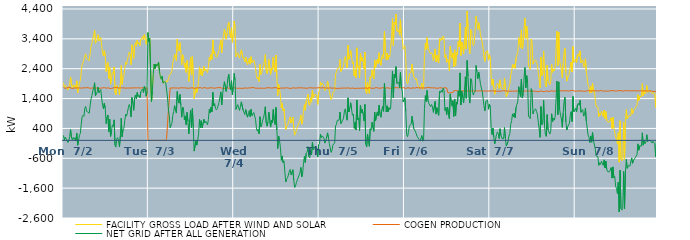
| Category | FACILITY GROSS LOAD AFTER WIND AND SOLAR | COGEN PRODUCTION | NET GRID AFTER ALL GENERATION |
|---|---|---|---|
|  Mon  7/2 | 1935 | 1768 | 167 |
|  Mon  7/2 | 1765 | 1754 | 11 |
|  Mon  7/2 | 1843 | 1743 | 100 |
|  Mon  7/2 | 1826 | 1759 | 67 |
|  Mon  7/2 | 1769 | 1756 | 13 |
|  Mon  7/2 | 1681 | 1752 | -71 |
|  Mon  7/2 | 1761 | 1776 | -15 |
|  Mon  7/2 | 1900 | 1770 | 130 |
|  Mon  7/2 | 2123 | 1761 | 362 |
|  Mon  7/2 | 1851 | 1763 | 88 |
|  Mon  7/2 | 1757 | 1735 | 22 |
|  Mon  7/2 | 1863 | 1763 | 100 |
|  Mon  7/2 | 1781 | 1754 | 27 |
|  Mon  7/2 | 1845 | 1758 | 87 |
|  Mon  7/2 | 1740 | 1756 | -16 |
|  Mon  7/2 | 1995 | 1759 | 236 |
|  Mon  7/2 | 1589 | 1752 | -163 |
|  Mon  7/2 | 1749 | 1757 | -8 |
|  Mon  7/2 | 1929 | 1757 | 172 |
|  Mon  7/2 | 2001 | 1770 | 231 |
|  Mon  7/2 | 2288 | 1750 | 538 |
|  Mon  7/2 | 2538 | 1747 | 791 |
|  Mon  7/2 | 2598 | 1759 | 839 |
|  Mon  7/2 | 2570 | 1769 | 801 |
|  Mon  7/2 | 2824 | 1759 | 1065 |
|  Mon  7/2 | 2896 | 1758 | 1138 |
|  Mon  7/2 | 2749 | 1765 | 984 |
|  Mon  7/2 | 2712 | 1762 | 950 |
|  Mon  7/2 | 2735 | 1764 | 971 |
|  Mon  7/2 | 2668 | 1759 | 909 |
|  Mon  7/2 | 2905 | 1742 | 1163 |
|  Mon  7/2 | 3137 | 1756 | 1381 |
|  Mon  7/2 | 3253 | 1755 | 1498 |
|  Mon  7/2 | 3418 | 1761 | 1657 |
|  Mon  7/2 | 3497 | 1751 | 1746 |
|  Mon  7/2 | 3693 | 1764 | 1929 |
|  Mon  7/2 | 3253 | 1754 | 1499 |
|  Mon  7/2 | 3302 | 1768 | 1534 |
|  Mon  7/2 | 3380 | 1753 | 1627 |
|  Mon  7/2 | 3540 | 1758 | 1782 |
|  Mon  7/2 | 3332 | 1736 | 1596 |
|  Mon  7/2 | 3360 | 1747 | 1613 |
|  Mon  7/2 | 3449 | 1749 | 1700 |
|  Mon  7/2 | 3179 | 1761 | 1418 |
|  Mon  7/2 | 2931 | 1758 | 1173 |
|  Mon  7/2 | 2824 | 1765 | 1059 |
|  Mon  7/2 | 3007 | 1767 | 1240 |
|  Mon  7/2 | 2823 | 1752 | 1071 |
|  Mon  7/2 | 2304 | 1745 | 559 |
|  Mon  7/2 | 2541 | 1767 | 774 |
|  Mon  7/2 | 2614 | 1763 | 851 |
|  Mon  7/2 | 2064 | 1774 | 290 |
|  Mon  7/2 | 2455 | 1742 | 713 |
|  Mon  7/2 | 1881 | 1749 | 132 |
|  Mon  7/2 | 2039 | 1739 | 300 |
|  Mon  7/2 | 2265 | 1748 | 517 |
|  Mon  7/2 | 2229 | 1761 | 468 |
|  Mon  7/2 | 2457 | 1770 | 687 |
|  Mon  7/2 | 1599 | 1762 | -163 |
|  Mon  7/2 | 1522 | 1749 | -227 |
|  Mon  7/2 | 1834 | 1777 | 57 |
|  Mon  7/2 | 1836 | 1745 | 91 |
|  Mon  7/2 | 1726 | 1748 | -22 |
|  Mon  7/2 | 1526 | 1747 | -221 |
|  Mon  7/2 | 1903 | 1760 | 143 |
|  Mon  7/2 | 2509 | 1767 | 742 |
|  Mon  7/2 | 1874 | 1756 | 118 |
|  Mon  7/2 | 2131 | 1762 | 369 |
|  Mon  7/2 | 2166 | 1759 | 407 |
|  Mon  7/2 | 2427 | 1758 | 669 |
|  Mon  7/2 | 2622 | 1748 | 874 |
|  Mon  7/2 | 2547 | 1734 | 813 |
|  Mon  7/2 | 2699 | 1755 | 944 |
|  Mon  7/2 | 2839 | 1746 | 1093 |
|  Mon  7/2 | 2955 | 1754 | 1201 |
|  Mon  7/2 | 2888 | 1769 | 1119 |
|  Mon  7/2 | 2537 | 1752 | 785 |
|  Mon  7/2 | 3199 | 1766 | 1433 |
|  Mon  7/2 | 3011 | 1756 | 1255 |
|  Mon  7/2 | 2738 | 1732 | 1006 |
|  Mon  7/2 | 3177 | 1760 | 1417 |
|  Mon  7/2 | 3274 | 1753 | 1521 |
|  Mon  7/2 | 3150 | 1756 | 1394 |
|  Mon  7/2 | 3361 | 1757 | 1604 |
|  Mon  7/2 | 3230 | 1763 | 1467 |
|  Mon  7/2 | 3270 | 1766 | 1504 |
|  Mon  7/2 | 3175 | 1750 | 1425 |
|  Mon  7/2 | 3377 | 1749 | 1628 |
|  Mon  7/2 | 3422 | 1761 | 1661 |
|  Mon  7/2 | 3478 | 1758 | 1720 |
|  Mon  7/2 | 3359 | 1756 | 1603 |
|  Mon  7/2 | 3549 | 1745 | 1804 |
|  Mon  7/2 | 3480 | 1753 | 1727 |
|  Mon  7/2 | 3212 | 1734 | 1478 |
|  Mon  7/2 | 3386 | 1753 | 1633 |
|  Mon  7/2 | 3609 | 0 | 3609 |
|  Tue  7/3 | 3308 | 0 | 3308 |
|  Tue  7/3 | 3413 | 0 | 3413 |
|  Tue  7/3 | 3393 | 0 | 3393 |
|  Tue  7/3 | 1288 | 0 | 1288 |
|  Tue  7/3 | 1656 | 0 | 1656 |
|  Tue  7/3 | 2215 | 0 | 2215 |
|  Tue  7/3 | 2554 | 0 | 2554 |
|  Tue  7/3 | 2406 | 0 | 2406 |
|  Tue  7/3 | 2554 | 0 | 2554 |
|  Tue  7/3 | 2480 | 0 | 2480 |
|  Tue  7/3 | 2468 | 0 | 2468 |
|  Tue  7/3 | 2619 | 0 | 2619 |
|  Tue  7/3 | 2304 | 0 | 2304 |
|  Tue  7/3 | 2134 | 0 | 2134 |
|  Tue  7/3 | 2043 | 0 | 2043 |
|  Tue  7/3 | 2154 | 0 | 2154 |
|  Tue  7/3 | 1917 | 0 | 1917 |
|  Tue  7/3 | 1903 | 0 | 1903 |
|  Tue  7/3 | 1972 | 0 | 1972 |
|  Tue  7/3 | 1931 | 0 | 1931 |
|  Tue  7/3 | 2001 | 52 | 1949 |
|  Tue  7/3 | 1963 | 510 | 1453 |
|  Tue  7/3 | 2048 | 997 | 1051 |
|  Tue  7/3 | 2173 | 1348 | 825 |
|  Tue  7/3 | 2186 | 1759 | 427 |
|  Tue  7/3 | 2253 | 1745 | 508 |
|  Tue  7/3 | 2323 | 1748 | 575 |
|  Tue  7/3 | 2600 | 1763 | 837 |
|  Tue  7/3 | 2729 | 1763 | 966 |
|  Tue  7/3 | 2894 | 1731 | 1163 |
|  Tue  7/3 | 2760 | 1752 | 1008 |
|  Tue  7/3 | 2666 | 1752 | 914 |
|  Tue  7/3 | 3390 | 1754 | 1636 |
|  Tue  7/3 | 3088 | 1742 | 1346 |
|  Tue  7/3 | 2991 | 1746 | 1245 |
|  Tue  7/3 | 3273 | 1737 | 1536 |
|  Tue  7/3 | 2946 | 1764 | 1182 |
|  Tue  7/3 | 2537 | 1760 | 777 |
|  Tue  7/3 | 2874 | 1757 | 1117 |
|  Tue  7/3 | 2820 | 1767 | 1053 |
|  Tue  7/3 | 2450 | 1761 | 689 |
|  Tue  7/3 | 2587 | 1768 | 819 |
|  Tue  7/3 | 2278 | 1753 | 525 |
|  Tue  7/3 | 2673 | 1736 | 937 |
|  Tue  7/3 | 2385 | 1746 | 639 |
|  Tue  7/3 | 1968 | 1751 | 217 |
|  Tue  7/3 | 2432 | 1750 | 682 |
|  Tue  7/3 | 2778 | 1762 | 1016 |
|  Tue  7/3 | 2187 | 1759 | 428 |
|  Tue  7/3 | 2819 | 1754 | 1065 |
|  Tue  7/3 | 2178 | 1754 | 424 |
|  Tue  7/3 | 1394 | 1754 | -360 |
|  Tue  7/3 | 1381 | 1740 | -359 |
|  Tue  7/3 | 1762 | 1759 | 3 |
|  Tue  7/3 | 1602 | 1761 | -159 |
|  Tue  7/3 | 1761 | 1749 | 12 |
|  Tue  7/3 | 1971 | 1756 | 215 |
|  Tue  7/3 | 2462 | 1759 | 703 |
|  Tue  7/3 | 2204 | 1770 | 434 |
|  Tue  7/3 | 2397 | 1737 | 660 |
|  Tue  7/3 | 2162 | 1740 | 422 |
|  Tue  7/3 | 2145 | 1752 | 393 |
|  Tue  7/3 | 2476 | 1772 | 704 |
|  Tue  7/3 | 2329 | 1744 | 585 |
|  Tue  7/3 | 2391 | 1754 | 637 |
|  Tue  7/3 | 2345 | 1758 | 587 |
|  Tue  7/3 | 2267 | 1749 | 518 |
|  Tue  7/3 | 2444 | 1748 | 696 |
|  Tue  7/3 | 2787 | 1752 | 1035 |
|  Tue  7/3 | 2670 | 1752 | 918 |
|  Tue  7/3 | 2875 | 1765 | 1110 |
|  Tue  7/3 | 2719 | 1763 | 956 |
|  Tue  7/3 | 3364 | 1754 | 1610 |
|  Tue  7/3 | 2909 | 1759 | 1150 |
|  Tue  7/3 | 2977 | 1747 | 1230 |
|  Tue  7/3 | 2819 | 1747 | 1072 |
|  Tue  7/3 | 2777 | 1758 | 1019 |
|  Tue  7/3 | 2818 | 1755 | 1063 |
|  Tue  7/3 | 2799 | 1765 | 1034 |
|  Tue  7/3 | 3018 | 1742 | 1276 |
|  Tue  7/3 | 3047 | 1770 | 1277 |
|  Tue  7/3 | 3370 | 1746 | 1624 |
|  Tue  7/3 | 2937 | 1750 | 1187 |
|  Tue  7/3 | 3282 | 1740 | 1542 |
|  Tue  7/3 | 3524 | 1743 | 1781 |
|  Tue  7/3 | 3731 | 1767 | 1964 |
|  Tue  7/3 | 3701 | 1740 | 1961 |
|  Tue  7/3 | 3390 | 1749 | 1641 |
|  Tue  7/3 | 3577 | 1763 | 1814 |
|  Tue  7/3 | 3867 | 1751 | 2116 |
|  Tue  7/3 | 3957 | 1746 | 2211 |
|  Tue  7/3 | 3586 | 1762 | 1824 |
|  Tue  7/3 | 3440 | 1752 | 1688 |
|  Tue  7/3 | 3768 | 1771 | 1997 |
|  Tue  7/3 | 3267 | 1738 | 1529 |
|  Tue  7/3 | 3558 | 1756 | 1802 |
|  Wed  7/4 | 3999 | 1759 | 2240 |
|  Wed  7/4 | 3775 | 1769 | 2006 |
|  Wed  7/4 | 2798 | 1757 | 1041 |
|  Wed  7/4 | 2891 | 1763 | 1128 |
|  Wed  7/4 | 2934 | 1739 | 1195 |
|  Wed  7/4 | 2909 | 1733 | 1176 |
|  Wed  7/4 | 2751 | 1749 | 1002 |
|  Wed  7/4 | 2890 | 1764 | 1126 |
|  Wed  7/4 | 3032 | 1742 | 1290 |
|  Wed  7/4 | 3046 | 1752 | 1294 |
|  Wed  7/4 | 2759 | 1742 | 1017 |
|  Wed  7/4 | 2722 | 1736 | 986 |
|  Wed  7/4 | 2626 | 1759 | 867 |
|  Wed  7/4 | 2787 | 1757 | 1030 |
|  Wed  7/4 | 2765 | 1745 | 1020 |
|  Wed  7/4 | 2535 | 1757 | 778 |
|  Wed  7/4 | 2616 | 1758 | 858 |
|  Wed  7/4 | 2752 | 1759 | 993 |
|  Wed  7/4 | 2550 | 1754 | 796 |
|  Wed  7/4 | 2803 | 1764 | 1039 |
|  Wed  7/4 | 2596 | 1769 | 827 |
|  Wed  7/4 | 2582 | 1767 | 815 |
|  Wed  7/4 | 2698 | 1766 | 932 |
|  Wed  7/4 | 2677 | 1748 | 929 |
|  Wed  7/4 | 2455 | 1746 | 709 |
|  Wed  7/4 | 2172 | 1757 | 415 |
|  Wed  7/4 | 2058 | 1748 | 310 |
|  Wed  7/4 | 2122 | 1753 | 369 |
|  Wed  7/4 | 1962 | 1745 | 217 |
|  Wed  7/4 | 2540 | 1749 | 791 |
|  Wed  7/4 | 2205 | 1750 | 455 |
|  Wed  7/4 | 2267 | 1746 | 521 |
|  Wed  7/4 | 2426 | 1746 | 680 |
|  Wed  7/4 | 2523 | 1769 | 754 |
|  Wed  7/4 | 2644 | 1742 | 902 |
|  Wed  7/4 | 2873 | 1748 | 1125 |
|  Wed  7/4 | 2340 | 1756 | 584 |
|  Wed  7/4 | 2232 | 1758 | 474 |
|  Wed  7/4 | 2376 | 1763 | 613 |
|  Wed  7/4 | 2706 | 1761 | 945 |
|  Wed  7/4 | 2703 | 1762 | 941 |
|  Wed  7/4 | 2207 | 1762 | 445 |
|  Wed  7/4 | 2419 | 1751 | 668 |
|  Wed  7/4 | 2357 | 1768 | 589 |
|  Wed  7/4 | 2791 | 1758 | 1033 |
|  Wed  7/4 | 2410 | 1749 | 661 |
|  Wed  7/4 | 2295 | 1766 | 529 |
|  Wed  7/4 | 2860 | 1758 | 1102 |
|  Wed  7/4 | 2105 | 1757 | 348 |
|  Wed  7/4 | 1497 | 1772 | -275 |
|  Wed  7/4 | 1874 | 1728 | 146 |
|  Wed  7/4 | 1736 | 1746 | -10 |
|  Wed  7/4 | 1516 | 1750 | -234 |
|  Wed  7/4 | 1086 | 1754 | -668 |
|  Wed  7/4 | 1233 | 1754 | -521 |
|  Wed  7/4 | 996 | 1744 | -748 |
|  Wed  7/4 | 1060 | 1747 | -687 |
|  Wed  7/4 | 690 | 1745 | -1055 |
|  Wed  7/4 | 367 | 1758 | -1391 |
|  Wed  7/4 | 460 | 1753 | -1293 |
|  Wed  7/4 | 501 | 1759 | -1258 |
|  Wed  7/4 | 511 | 1739 | -1228 |
|  Wed  7/4 | 694 | 1743 | -1049 |
|  Wed  7/4 | 779 | 1754 | -975 |
|  Wed  7/4 | 582 | 1740 | -1158 |
|  Wed  7/4 | 599 | 1750 | -1151 |
|  Wed  7/4 | 777 | 1763 | -986 |
|  Wed  7/4 | 404 | 1737 | -1333 |
|  Wed  7/4 | 173 | 1752 | -1579 |
|  Wed  7/4 | 233 | 1757 | -1524 |
|  Wed  7/4 | 339 | 1749 | -1410 |
|  Wed  7/4 | 438 | 1762 | -1324 |
|  Wed  7/4 | 444 | 1763 | -1319 |
|  Wed  7/4 | 600 | 1761 | -1161 |
|  Wed  7/4 | 672 | 1757 | -1085 |
|  Wed  7/4 | 851 | 1757 | -906 |
|  Wed  7/4 | 542 | 1762 | -1220 |
|  Wed  7/4 | 651 | 1752 | -1101 |
|  Wed  7/4 | 1002 | 1752 | -750 |
|  Wed  7/4 | 1196 | 1736 | -540 |
|  Wed  7/4 | 1006 | 1751 | -745 |
|  Wed  7/4 | 1317 | 1752 | -435 |
|  Wed  7/4 | 1346 | 1743 | -397 |
|  Wed  7/4 | 1543 | 1756 | -213 |
|  Wed  7/4 | 1216 | 1760 | -544 |
|  Wed  7/4 | 1169 | 1754 | -585 |
|  Wed  7/4 | 1427 | 1763 | -336 |
|  Wed  7/4 | 1280 | 1761 | -481 |
|  Wed  7/4 | 1683 | 1754 | -71 |
|  Wed  7/4 | 1433 | 1754 | -321 |
|  Wed  7/4 | 1463 | 1755 | -292 |
|  Wed  7/4 | 1549 | 1749 | -200 |
|  Wed  7/4 | 1523 | 1754 | -231 |
|  Wed  7/4 | 1503 | 1761 | -258 |
|  Wed  7/4 | 1203 | 1761 | -558 |
|  Wed  7/4 | 1614 | 1762 | -148 |
|  Thu  7/5 | 1662 | 1765 | -103 |
|  Thu  7/5 | 1959 | 1753 | 206 |
|  Thu  7/5 | 1847 | 1754 | 93 |
|  Thu  7/5 | 1915 | 1765 | 150 |
|  Thu  7/5 | 1879 | 1764 | 115 |
|  Thu  7/5 | 1810 | 1750 | 60 |
|  Thu  7/5 | 1660 | 1753 | -93 |
|  Thu  7/5 | 1725 | 1741 | -16 |
|  Thu  7/5 | 1763 | 1756 | 7 |
|  Thu  7/5 | 1987 | 1736 | 251 |
|  Thu  7/5 | 1834 | 1747 | 87 |
|  Thu  7/5 | 1648 | 1750 | -102 |
|  Thu  7/5 | 1640 | 1761 | -121 |
|  Thu  7/5 | 1362 | 1766 | -404 |
|  Thu  7/5 | 1422 | 1749 | -327 |
|  Thu  7/5 | 1596 | 1755 | -159 |
|  Thu  7/5 | 1590 | 1753 | -163 |
|  Thu  7/5 | 1660 | 1743 | -83 |
|  Thu  7/5 | 2225 | 1745 | 480 |
|  Thu  7/5 | 2288 | 1750 | 538 |
|  Thu  7/5 | 2411 | 1738 | 673 |
|  Thu  7/5 | 2442 | 1756 | 686 |
|  Thu  7/5 | 2424 | 1748 | 676 |
|  Thu  7/5 | 2709 | 1759 | 950 |
|  Thu  7/5 | 2304 | 1743 | 561 |
|  Thu  7/5 | 2356 | 1751 | 605 |
|  Thu  7/5 | 2428 | 1753 | 675 |
|  Thu  7/5 | 2491 | 1746 | 745 |
|  Thu  7/5 | 2744 | 1752 | 992 |
|  Thu  7/5 | 2812 | 1757 | 1055 |
|  Thu  7/5 | 2592 | 1749 | 843 |
|  Thu  7/5 | 2427 | 1752 | 675 |
|  Thu  7/5 | 3184 | 1760 | 1424 |
|  Thu  7/5 | 2714 | 1764 | 950 |
|  Thu  7/5 | 2819 | 1744 | 1075 |
|  Thu  7/5 | 3012 | 1753 | 1259 |
|  Thu  7/5 | 2795 | 1746 | 1049 |
|  Thu  7/5 | 2565 | 1725 | 840 |
|  Thu  7/5 | 2629 | 1752 | 877 |
|  Thu  7/5 | 2156 | 1753 | 403 |
|  Thu  7/5 | 2345 | 1737 | 608 |
|  Thu  7/5 | 2095 | 1749 | 346 |
|  Thu  7/5 | 3100 | 1747 | 1353 |
|  Thu  7/5 | 2441 | 1751 | 690 |
|  Thu  7/5 | 2491 | 1744 | 747 |
|  Thu  7/5 | 2090 | 1763 | 327 |
|  Thu  7/5 | 2925 | 1745 | 1180 |
|  Thu  7/5 | 2672 | 1753 | 919 |
|  Thu  7/5 | 2786 | 1753 | 1033 |
|  Thu  7/5 | 2629 | 1753 | 876 |
|  Thu  7/5 | 2397 | 1746 | 651 |
|  Thu  7/5 | 2958 | 1755 | 1203 |
|  Thu  7/5 | 1636 | 1762 | -126 |
|  Thu  7/5 | 1562 | 1779 | -217 |
|  Thu  7/5 | 1950 | 1736 | 214 |
|  Thu  7/5 | 1698 | 1740 | -42 |
|  Thu  7/5 | 1572 | 1769 | -197 |
|  Thu  7/5 | 2132 | 1742 | 390 |
|  Thu  7/5 | 2090 | 1747 | 343 |
|  Thu  7/5 | 2361 | 1756 | 605 |
|  Thu  7/5 | 2361 | 1744 | 617 |
|  Thu  7/5 | 2055 | 1752 | 303 |
|  Thu  7/5 | 2694 | 1751 | 943 |
|  Thu  7/5 | 2427 | 1768 | 659 |
|  Thu  7/5 | 2459 | 1770 | 689 |
|  Thu  7/5 | 2715 | 1762 | 953 |
|  Thu  7/5 | 2570 | 1749 | 821 |
|  Thu  7/5 | 2933 | 1754 | 1179 |
|  Thu  7/5 | 2609 | 1748 | 861 |
|  Thu  7/5 | 2515 | 1741 | 774 |
|  Thu  7/5 | 2788 | 1758 | 1030 |
|  Thu  7/5 | 2874 | 1741 | 1133 |
|  Thu  7/5 | 2738 | 1765 | 973 |
|  Thu  7/5 | 3653 | 1741 | 1912 |
|  Thu  7/5 | 3142 | 1743 | 1399 |
|  Thu  7/5 | 2688 | 1737 | 951 |
|  Thu  7/5 | 2922 | 1763 | 1159 |
|  Thu  7/5 | 2708 | 1755 | 953 |
|  Thu  7/5 | 2850 | 1750 | 1100 |
|  Thu  7/5 | 2796 | 1766 | 1030 |
|  Thu  7/5 | 2829 | 1745 | 1084 |
|  Thu  7/5 | 3449 | 1761 | 1688 |
|  Thu  7/5 | 4082 | 1758 | 2324 |
|  Thu  7/5 | 3172 | 1747 | 1425 |
|  Thu  7/5 | 3961 | 1739 | 2222 |
|  Thu  7/5 | 3871 | 1775 | 2096 |
|  Thu  7/5 | 4225 | 1757 | 2468 |
|  Thu  7/5 | 3669 | 1761 | 1908 |
|  Thu  7/5 | 3632 | 1755 | 1877 |
|  Thu  7/5 | 3702 | 1758 | 1944 |
|  Thu  7/5 | 3524 | 1760 | 1764 |
|  Thu  7/5 | 4040 | 1765 | 2275 |
|  Thu  7/5 | 3506 | 1740 | 1766 |
|  Thu  7/5 | 3416 | 1762 | 1654 |
|  Thu  7/5 | 3056 | 1768 | 1288 |
|  Thu  7/5 | 3115 | 1762 | 1353 |
|  Fri  7/6 | 3171 | 1743 | 1428 |
|  Fri  7/6 | 2710 | 1741 | 969 |
|  Fri  7/6 | 1960 | 1762 | 198 |
|  Fri  7/6 | 1882 | 1762 | 120 |
|  Fri  7/6 | 2031 | 1761 | 270 |
|  Fri  7/6 | 2234 | 1756 | 478 |
|  Fri  7/6 | 2220 | 1750 | 470 |
|  Fri  7/6 | 2289 | 1740 | 549 |
|  Fri  7/6 | 2559 | 1749 | 810 |
|  Fri  7/6 | 2542 | 1764 | 778 |
|  Fri  7/6 | 2134 | 1744 | 390 |
|  Fri  7/6 | 2094 | 1748 | 346 |
|  Fri  7/6 | 2029 | 1749 | 280 |
|  Fri  7/6 | 2079 | 1771 | 308 |
|  Fri  7/6 | 1884 | 1766 | 118 |
|  Fri  7/6 | 1853 | 1761 | 92 |
|  Fri  7/6 | 1783 | 1755 | 28 |
|  Fri  7/6 | 1734 | 1756 | -22 |
|  Fri  7/6 | 1811 | 1744 | 67 |
|  Fri  7/6 | 1913 | 1752 | 161 |
|  Fri  7/6 | 1710 | 1738 | -28 |
|  Fri  7/6 | 1777 | 1761 | 16 |
|  Fri  7/6 | 2823 | 1757 | 1066 |
|  Fri  7/6 | 3249 | 1751 | 1498 |
|  Fri  7/6 | 3043 | 1742 | 1301 |
|  Fri  7/6 | 3439 | 1767 | 1672 |
|  Fri  7/6 | 3074 | 1745 | 1329 |
|  Fri  7/6 | 3003 | 1769 | 1234 |
|  Fri  7/6 | 2987 | 1767 | 1220 |
|  Fri  7/6 | 2891 | 1761 | 1130 |
|  Fri  7/6 | 2934 | 1734 | 1200 |
|  Fri  7/6 | 2880 | 1758 | 1122 |
|  Fri  7/6 | 2675 | 1737 | 938 |
|  Fri  7/6 | 2685 | 1758 | 927 |
|  Fri  7/6 | 3061 | 1757 | 1304 |
|  Fri  7/6 | 2629 | 1749 | 880 |
|  Fri  7/6 | 2853 | 1759 | 1094 |
|  Fri  7/6 | 2682 | 1744 | 938 |
|  Fri  7/6 | 2587 | 1751 | 836 |
|  Fri  7/6 | 3401 | 1761 | 1640 |
|  Fri  7/6 | 3332 | 1738 | 1594 |
|  Fri  7/6 | 3435 | 1759 | 1676 |
|  Fri  7/6 | 3363 | 1752 | 1611 |
|  Fri  7/6 | 3495 | 1745 | 1750 |
|  Fri  7/6 | 3427 | 1747 | 1680 |
|  Fri  7/6 | 2770 | 1766 | 1004 |
|  Fri  7/6 | 2865 | 1763 | 1102 |
|  Fri  7/6 | 2614 | 1751 | 863 |
|  Fri  7/6 | 2717 | 1609 | 1108 |
|  Fri  7/6 | 2683 | 1603 | 1080 |
|  Fri  7/6 | 2323 | 1592 | 731 |
|  Fri  7/6 | 3160 | 1603 | 1557 |
|  Fri  7/6 | 2884 | 1597 | 1287 |
|  Fri  7/6 | 2752 | 1606 | 1146 |
|  Fri  7/6 | 2930 | 1602 | 1328 |
|  Fri  7/6 | 2465 | 1662 | 803 |
|  Fri  7/6 | 3035 | 1648 | 1387 |
|  Fri  7/6 | 2489 | 1665 | 824 |
|  Fri  7/6 | 2948 | 1661 | 1287 |
|  Fri  7/6 | 2870 | 1657 | 1213 |
|  Fri  7/6 | 3306 | 1651 | 1655 |
|  Fri  7/6 | 3132 | 1652 | 1480 |
|  Fri  7/6 | 3922 | 1663 | 2259 |
|  Fri  7/6 | 2841 | 1653 | 1188 |
|  Fri  7/6 | 3298 | 1656 | 1642 |
|  Fri  7/6 | 3087 | 1659 | 1428 |
|  Fri  7/6 | 2905 | 1653 | 1252 |
|  Fri  7/6 | 3301 | 1660 | 1641 |
|  Fri  7/6 | 3792 | 1662 | 2130 |
|  Fri  7/6 | 3059 | 1653 | 1406 |
|  Fri  7/6 | 4323 | 1648 | 2675 |
|  Fri  7/6 | 3799 | 1648 | 2151 |
|  Fri  7/6 | 3120 | 1667 | 1453 |
|  Fri  7/6 | 2900 | 1651 | 1249 |
|  Fri  7/6 | 3718 | 1652 | 2066 |
|  Fri  7/6 | 3680 | 1657 | 2023 |
|  Fri  7/6 | 3281 | 1646 | 1635 |
|  Fri  7/6 | 3174 | 1657 | 1517 |
|  Fri  7/6 | 3270 | 1667 | 1603 |
|  Fri  7/6 | 3288 | 1644 | 1644 |
|  Fri  7/6 | 4165 | 1656 | 2509 |
|  Fri  7/6 | 3959 | 1658 | 2301 |
|  Fri  7/6 | 3713 | 1648 | 2065 |
|  Fri  7/6 | 3936 | 1655 | 2281 |
|  Fri  7/6 | 3771 | 1661 | 2110 |
|  Fri  7/6 | 3534 | 1661 | 1873 |
|  Fri  7/6 | 3525 | 1653 | 1872 |
|  Fri  7/6 | 3281 | 1648 | 1633 |
|  Fri  7/6 | 3046 | 1662 | 1384 |
|  Fri  7/6 | 2777 | 1645 | 1132 |
|  Fri  7/6 | 2645 | 1654 | 991 |
|  Fri  7/6 | 2958 | 1657 | 1301 |
|  Fri  7/6 | 2952 | 1661 | 1291 |
|  Fri  7/6 | 2999 | 1649 | 1350 |
|  Fri  7/6 | 2685 | 1642 | 1043 |
|  Fri  7/6 | 2868 | 1655 | 1213 |
|  Sat  7/7 | 2779 | 1652 | 1127 |
|  Sat  7/7 | 2082 | 1661 | 421 |
|  Sat  7/7 | 1844 | 1654 | 190 |
|  Sat  7/7 | 2055 | 1649 | 406 |
|  Sat  7/7 | 1768 | 1657 | 111 |
|  Sat  7/7 | 1541 | 1656 | -115 |
|  Sat  7/7 | 1705 | 1658 | 47 |
|  Sat  7/7 | 1836 | 1641 | 195 |
|  Sat  7/7 | 1920 | 1638 | 282 |
|  Sat  7/7 | 1875 | 1654 | 221 |
|  Sat  7/7 | 1737 | 1674 | 63 |
|  Sat  7/7 | 2029 | 1639 | 390 |
|  Sat  7/7 | 1811 | 1647 | 164 |
|  Sat  7/7 | 1729 | 1658 | 71 |
|  Sat  7/7 | 1702 | 1648 | 54 |
|  Sat  7/7 | 1713 | 1661 | 52 |
|  Sat  7/7 | 2091 | 1663 | 428 |
|  Sat  7/7 | 1730 | 1658 | 72 |
|  Sat  7/7 | 1463 | 1655 | -192 |
|  Sat  7/7 | 1474 | 1651 | -177 |
|  Sat  7/7 | 1620 | 1660 | -40 |
|  Sat  7/7 | 1789 | 1646 | 143 |
|  Sat  7/7 | 1885 | 1653 | 232 |
|  Sat  7/7 | 2186 | 1647 | 539 |
|  Sat  7/7 | 2292 | 1632 | 660 |
|  Sat  7/7 | 2538 | 1651 | 887 |
|  Sat  7/7 | 2438 | 1644 | 794 |
|  Sat  7/7 | 2557 | 1644 | 913 |
|  Sat  7/7 | 2412 | 1656 | 756 |
|  Sat  7/7 | 2763 | 1655 | 1108 |
|  Sat  7/7 | 2867 | 1665 | 1202 |
|  Sat  7/7 | 2962 | 1653 | 1309 |
|  Sat  7/7 | 3446 | 1648 | 1798 |
|  Sat  7/7 | 3269 | 1658 | 1611 |
|  Sat  7/7 | 3103 | 1641 | 1462 |
|  Sat  7/7 | 3701 | 1646 | 2055 |
|  Sat  7/7 | 3069 | 1652 | 1417 |
|  Sat  7/7 | 3179 | 1638 | 1541 |
|  Sat  7/7 | 3745 | 1655 | 2090 |
|  Sat  7/7 | 4093 | 1651 | 2442 |
|  Sat  7/7 | 3417 | 1655 | 1762 |
|  Sat  7/7 | 3824 | 1657 | 2167 |
|  Sat  7/7 | 3571 | 1651 | 1920 |
|  Sat  7/7 | 2472 | 1659 | 813 |
|  Sat  7/7 | 2463 | 1650 | 813 |
|  Sat  7/7 | 2373 | 1645 | 728 |
|  Sat  7/7 | 3390 | 1660 | 1730 |
|  Sat  7/7 | 3286 | 1658 | 1628 |
|  Sat  7/7 | 2553 | 1664 | 889 |
|  Sat  7/7 | 2632 | 1644 | 988 |
|  Sat  7/7 | 2630 | 1655 | 975 |
|  Sat  7/7 | 2702 | 1645 | 1057 |
|  Sat  7/7 | 2607 | 1645 | 962 |
|  Sat  7/7 | 2510 | 1631 | 879 |
|  Sat  7/7 | 2267 | 1658 | 609 |
|  Sat  7/7 | 2012 | 1637 | 375 |
|  Sat  7/7 | 1753 | 1652 | 101 |
|  Sat  7/7 | 2791 | 1658 | 1133 |
|  Sat  7/7 | 2172 | 1644 | 528 |
|  Sat  7/7 | 2232 | 1638 | 594 |
|  Sat  7/7 | 2986 | 1646 | 1340 |
|  Sat  7/7 | 2133 | 1637 | 496 |
|  Sat  7/7 | 1856 | 1647 | 209 |
|  Sat  7/7 | 1789 | 1655 | 134 |
|  Sat  7/7 | 2521 | 1659 | 862 |
|  Sat  7/7 | 1983 | 1640 | 343 |
|  Sat  7/7 | 2015 | 1646 | 369 |
|  Sat  7/7 | 1856 | 1645 | 211 |
|  Sat  7/7 | 1991 | 1662 | 329 |
|  Sat  7/7 | 2554 | 1664 | 890 |
|  Sat  7/7 | 2278 | 1656 | 622 |
|  Sat  7/7 | 2388 | 1641 | 747 |
|  Sat  7/7 | 2324 | 1649 | 675 |
|  Sat  7/7 | 2446 | 1654 | 792 |
|  Sat  7/7 | 2433 | 1653 | 780 |
|  Sat  7/7 | 3653 | 1668 | 1985 |
|  Sat  7/7 | 2505 | 1647 | 858 |
|  Sat  7/7 | 3627 | 1668 | 1959 |
|  Sat  7/7 | 2677 | 1652 | 1025 |
|  Sat  7/7 | 2502 | 1659 | 843 |
|  Sat  7/7 | 2358 | 1643 | 715 |
|  Sat  7/7 | 2096 | 1658 | 438 |
|  Sat  7/7 | 2581 | 1659 | 922 |
|  Sat  7/7 | 2960 | 1656 | 1304 |
|  Sat  7/7 | 3086 | 1646 | 1440 |
|  Sat  7/7 | 2288 | 1668 | 620 |
|  Sat  7/7 | 1984 | 1638 | 346 |
|  Sat  7/7 | 2106 | 1651 | 455 |
|  Sat  7/7 | 2182 | 1667 | 515 |
|  Sat  7/7 | 2229 | 1657 | 572 |
|  Sat  7/7 | 2485 | 1650 | 835 |
|  Sat  7/7 | 2627 | 1666 | 961 |
|  Sat  7/7 | 2290 | 1659 | 631 |
|  Sat  7/7 | 3146 | 1676 | 1470 |
|  Sat  7/7 | 2610 | 1656 | 954 |
|  Sat  7/7 | 2612 | 1645 | 967 |
|  Sun  7/8 | 2723 | 1653 | 1070 |
|  Sun  7/8 | 2600 | 1650 | 950 |
|  Sun  7/8 | 2858 | 1675 | 1183 |
|  Sun  7/8 | 2900 | 1659 | 1241 |
|  Sun  7/8 | 2813 | 1641 | 1172 |
|  Sun  7/8 | 2997 | 1651 | 1346 |
|  Sun  7/8 | 2594 | 1656 | 938 |
|  Sun  7/8 | 2581 | 1656 | 925 |
|  Sun  7/8 | 2701 | 1674 | 1027 |
|  Sun  7/8 | 2452 | 1641 | 811 |
|  Sun  7/8 | 2513 | 1656 | 857 |
|  Sun  7/8 | 2731 | 1646 | 1085 |
|  Sun  7/8 | 2309 | 1666 | 643 |
|  Sun  7/8 | 2283 | 1663 | 620 |
|  Sun  7/8 | 1839 | 1664 | 175 |
|  Sun  7/8 | 1771 | 1662 | 109 |
|  Sun  7/8 | 1580 | 1653 | -73 |
|  Sun  7/8 | 1801 | 1653 | 148 |
|  Sun  7/8 | 1586 | 1648 | -62 |
|  Sun  7/8 | 1921 | 1659 | 262 |
|  Sun  7/8 | 1647 | 1651 | -4 |
|  Sun  7/8 | 1688 | 1667 | 21 |
|  Sun  7/8 | 1384 | 1648 | -264 |
|  Sun  7/8 | 1136 | 1657 | -521 |
|  Sun  7/8 | 1128 | 1640 | -512 |
|  Sun  7/8 | 1111 | 1654 | -543 |
|  Sun  7/8 | 793 | 1629 | -836 |
|  Sun  7/8 | 908 | 1660 | -752 |
|  Sun  7/8 | 842 | 1646 | -804 |
|  Sun  7/8 | 976 | 1675 | -699 |
|  Sun  7/8 | 922 | 1648 | -726 |
|  Sun  7/8 | 803 | 1644 | -841 |
|  Sun  7/8 | 1004 | 1656 | -652 |
|  Sun  7/8 | 731 | 1657 | -926 |
|  Sun  7/8 | 964 | 1656 | -692 |
|  Sun  7/8 | 671 | 1651 | -980 |
|  Sun  7/8 | 617 | 1665 | -1048 |
|  Sun  7/8 | 618 | 1643 | -1025 |
|  Sun  7/8 | 613 | 1667 | -1054 |
|  Sun  7/8 | 618 | 1665 | -1047 |
|  Sun  7/8 | 754 | 1668 | -914 |
|  Sun  7/8 | 400 | 1664 | -1264 |
|  Sun  7/8 | 770 | 1659 | -889 |
|  Sun  7/8 | 405 | 1662 | -1257 |
|  Sun  7/8 | 424 | 1636 | -1212 |
|  Sun  7/8 | 112 | 1653 | -1541 |
|  Sun  7/8 | 37 | 1652 | -1615 |
|  Sun  7/8 | -125 | 1657 | -1782 |
|  Sun  7/8 | 257 | 1653 | -1396 |
|  Sun  7/8 | -730 | 1666 | -2396 |
|  Sun  7/8 | 659 | 1660 | -1001 |
|  Sun  7/8 | -624 | 1667 | -2291 |
|  Sun  7/8 | -688 | 1647 | -2335 |
|  Sun  7/8 | -626 | 1647 | -2273 |
|  Sun  7/8 | 609 | 1650 | -1041 |
|  Sun  7/8 | -630 | 1662 | -2292 |
|  Sun  7/8 | 601 | 1671 | -1070 |
|  Sun  7/8 | 1031 | 1668 | -637 |
|  Sun  7/8 | 714 | 1653 | -939 |
|  Sun  7/8 | 728 | 1656 | -928 |
|  Sun  7/8 | 825 | 1656 | -831 |
|  Sun  7/8 | 799 | 1664 | -865 |
|  Sun  7/8 | 826 | 1665 | -839 |
|  Sun  7/8 | 1073 | 1659 | -586 |
|  Sun  7/8 | 885 | 1652 | -767 |
|  Sun  7/8 | 990 | 1663 | -673 |
|  Sun  7/8 | 999 | 1662 | -663 |
|  Sun  7/8 | 1080 | 1662 | -582 |
|  Sun  7/8 | 1084 | 1649 | -565 |
|  Sun  7/8 | 1172 | 1653 | -481 |
|  Sun  7/8 | 1535 | 1653 | -118 |
|  Sun  7/8 | 1331 | 1659 | -328 |
|  Sun  7/8 | 1471 | 1654 | -183 |
|  Sun  7/8 | 1450 | 1661 | -211 |
|  Sun  7/8 | 1466 | 1660 | -194 |
|  Sun  7/8 | 1904 | 1652 | 252 |
|  Sun  7/8 | 1492 | 1652 | -160 |
|  Sun  7/8 | 1663 | 1660 | 3 |
|  Sun  7/8 | 1550 | 1657 | -107 |
|  Sun  7/8 | 1602 | 1653 | -51 |
|  Sun  7/8 | 1839 | 1649 | 190 |
|  Sun  7/8 | 1608 | 1655 | -47 |
|  Sun  7/8 | 1672 | 1659 | 13 |
|  Sun  7/8 | 1650 | 1658 | -8 |
|  Sun  7/8 | 1639 | 1649 | -10 |
|  Sun  7/8 | 1633 | 1654 | -21 |
|  Sun  7/8 | 1561 | 1652 | -91 |
|  Sun  7/8 | 1606 | 1637 | -31 |
|  Sun  7/8 | 1623 | 1662 | -39 |
|  Sun  7/8 | 1526 | 1640 | -114 |
|  Sun  7/8 | 1106 | 1661 | -555 |
|  Sun  7/8 | 1718 | 1645 | 73 |